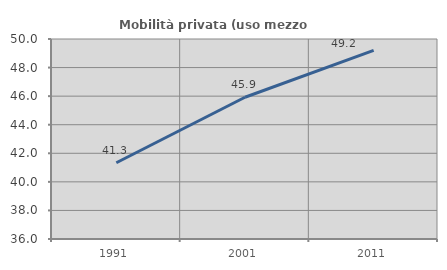
| Category | Mobilità privata (uso mezzo privato) |
|---|---|
| 1991.0 | 41.34 |
| 2001.0 | 45.924 |
| 2011.0 | 49.199 |